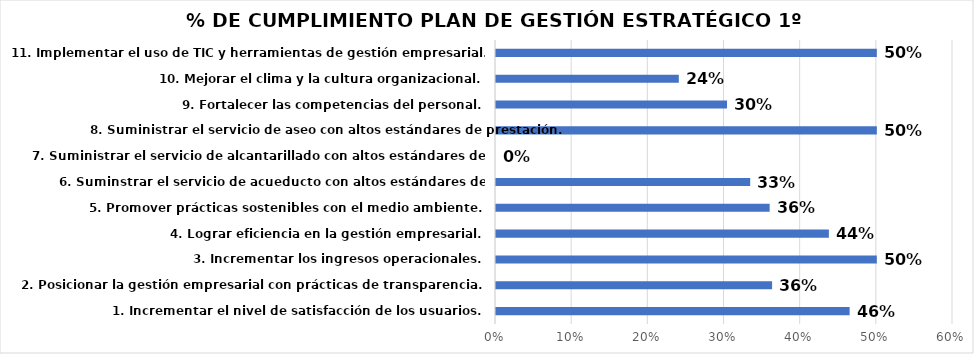
| Category | % DE CUMPLIMIENTO
 1º SEMESTRE |
|---|---|
| 1. Incrementar el nivel de satisfacción de los usuarios. | 0.464 |
| 2. Posicionar la gestión empresarial con prácticas de transparencia. | 0.362 |
| 3. Incrementar los ingresos operacionales. | 0.5 |
| 4. Lograr eficiencia en la gestión empresarial. | 0.437 |
| 5. Promover prácticas sostenibles con el medio ambiente. | 0.359 |
| 6. Suminstrar el servicio de acueducto con altos estándares de prestación. | 0.334 |
| 7. Suministrar el servicio de alcantarillado con altos estándares de prestación. | 0 |
| 8. Suministrar el servicio de aseo con altos estándares de prestación. | 0.5 |
| 9. Fortalecer las competencias del personal. | 0.303 |
| 10. Mejorar el clima y la cultura organizacional. | 0.24 |
| 11. Implementar el uso de TIC y herramientas de gestión empresarial. | 0.5 |